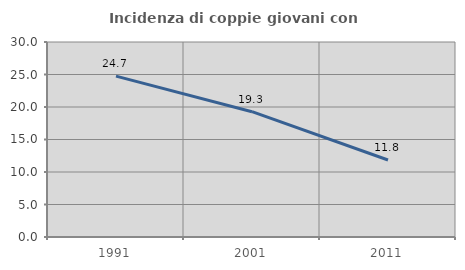
| Category | Incidenza di coppie giovani con figli |
|---|---|
| 1991.0 | 24.747 |
| 2001.0 | 19.277 |
| 2011.0 | 11.85 |